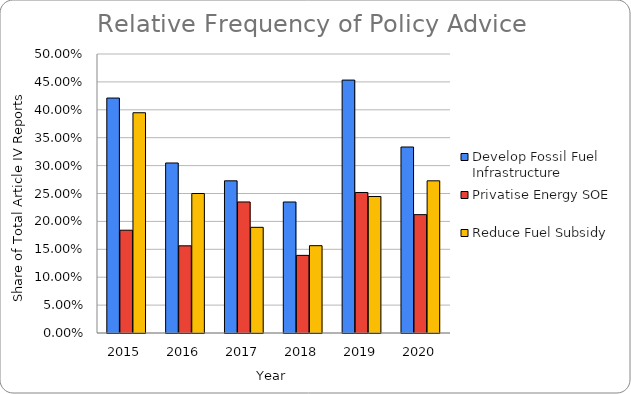
| Category | Develop Fossil Fuel Infrastructure | Privatise Energy SOE | Reduce Fuel Subsidy |
|---|---|---|---|
| 2015.0 | 0.421 | 0.184 | 0.395 |
| 2016.0 | 0.305 | 0.156 | 0.25 |
| 2017.0 | 0.273 | 0.235 | 0.189 |
| 2018.0 | 0.235 | 0.139 | 0.157 |
| 2019.0 | 0.453 | 0.252 | 0.245 |
| 2020.0 | 0.333 | 0.212 | 0.273 |